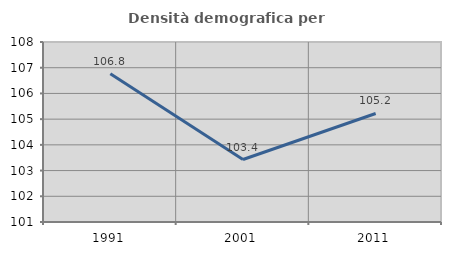
| Category | Densità demografica |
|---|---|
| 1991.0 | 106.77 |
| 2001.0 | 103.43 |
| 2011.0 | 105.22 |